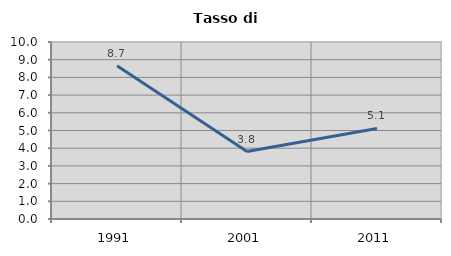
| Category | Tasso di disoccupazione   |
|---|---|
| 1991.0 | 8.656 |
| 2001.0 | 3.81 |
| 2011.0 | 5.117 |